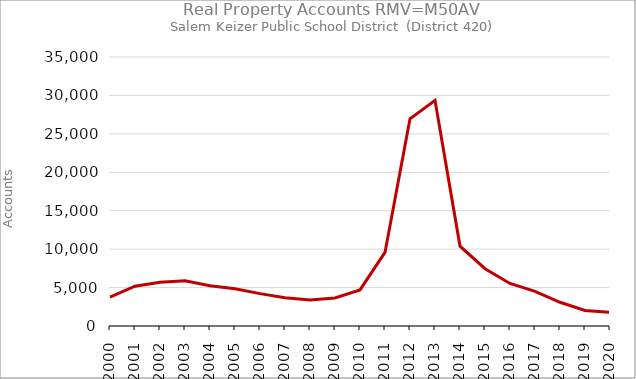
| Category | Series 0 |
|---|---|
| 2000.0 | 3756 |
| 2001.0 | 5182 |
| 2002.0 | 5678 |
| 2003.0 | 5894 |
| 2004.0 | 5233 |
| 2005.0 | 4842 |
| 2006.0 | 4212 |
| 2007.0 | 3676 |
| 2008.0 | 3387 |
| 2009.0 | 3649 |
| 2010.0 | 4700 |
| 2011.0 | 9574 |
| 2012.0 | 26956 |
| 2013.0 | 29366 |
| 2014.0 | 10394 |
| 2015.0 | 7453 |
| 2016.0 | 5532 |
| 2017.0 | 4515 |
| 2018.0 | 3087 |
| 2019.0 | 2025 |
| 2020.0 | 1780 |